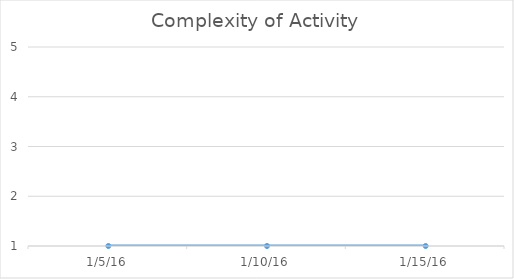
| Category | Series 0 |
|---|---|
| 1/5/16 | 1 |
| 1/10/16 | 1 |
| 1/15/16 | 1 |